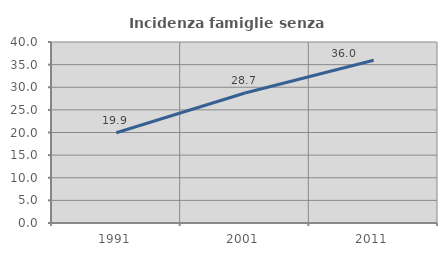
| Category | Incidenza famiglie senza nuclei |
|---|---|
| 1991.0 | 19.943 |
| 2001.0 | 28.721 |
| 2011.0 | 35.977 |